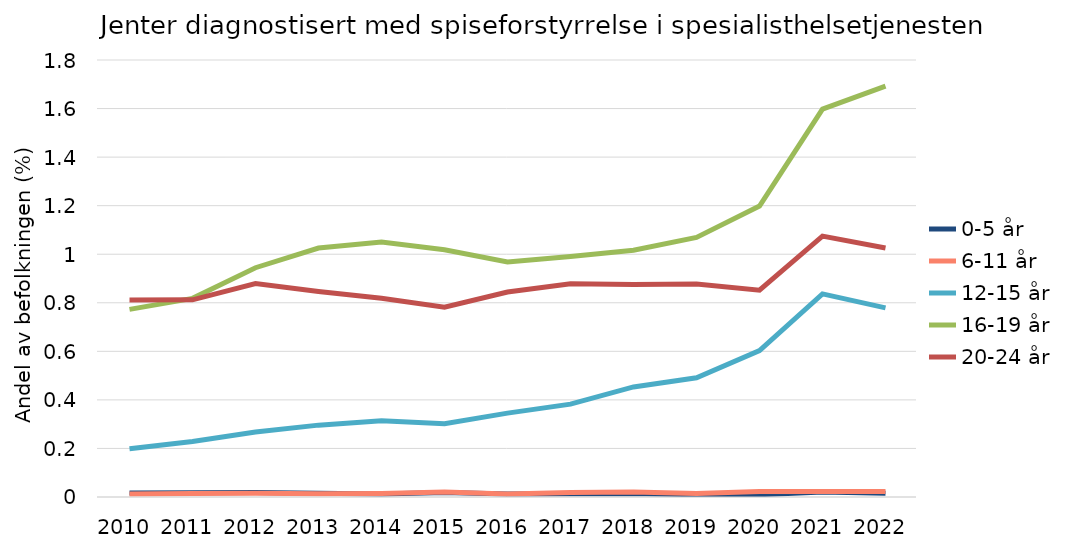
| Category | 0-5 år | 6-11 år | 12-15 år | 16-19 år | 20-24 år |
|---|---|---|---|---|---|
| 2010.0 | 0.016 | 0.012 | 0.198 | 0.773 | 0.812 |
| 2011.0 | 0.018 | 0.014 | 0.229 | 0.818 | 0.812 |
| 2012.0 | 0.018 | 0.016 | 0.268 | 0.944 | 0.88 |
| 2013.0 | 0.015 | 0.013 | 0.296 | 1.026 | 0.847 |
| 2014.0 | 0.012 | 0.014 | 0.314 | 1.051 | 0.818 |
| 2015.0 | 0.018 | 0.021 | 0.302 | 1.018 | 0.782 |
| 2016.0 | 0.013 | 0.012 | 0.346 | 0.968 | 0.845 |
| 2017.0 | 0.013 | 0.019 | 0.383 | 0.991 | 0.878 |
| 2018.0 | 0.014 | 0.021 | 0.453 | 1.016 | 0.876 |
| 2019.0 | 0.009 | 0.014 | 0.491 | 1.069 | 0.877 |
| 2020.0 | 0.009 | 0.023 | 0.603 | 1.198 | 0.852 |
| 2021.0 | 0.02 | 0.023 | 0.837 | 1.598 | 1.074 |
| 2022.0 | 0.015 | 0.023 | 0.779 | 1.692 | 1.025 |